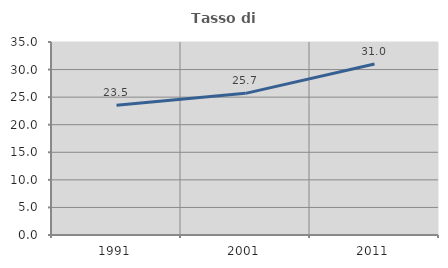
| Category | Tasso di occupazione   |
|---|---|
| 1991.0 | 23.522 |
| 2001.0 | 25.688 |
| 2011.0 | 31.02 |